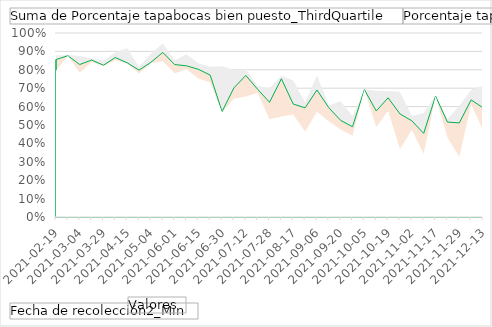
| Category | Suma de Porcentaje tapabocas bien puesto_ThirdQuartile | Porcentaje tapabocas bien puesto. | Suma de Porcentaje tapabocas bien puesto_FirstQuartile |
|---|---|---|---|
| 2021-02-19 | 0.878 | 0.856 | 0.795 |
| 2021-02-23 | 0.88 | 0.876 | 0.876 |
| 2021-03-04 | 0.875 | 0.829 | 0.784 |
| 2021-03-10 | 0.861 | 0.853 | 0.841 |
| 2021-03-29 | 0.85 | 0.825 | 0.82 |
| 2021-04-06 | 0.893 | 0.867 | 0.852 |
| 2021-04-15 | 0.917 | 0.838 | 0.832 |
| 2021-04-20 | 0.817 | 0.798 | 0.78 |
| 2021-05-04 | 0.887 | 0.841 | 0.836 |
| 2021-05-21 | 0.943 | 0.894 | 0.846 |
| 2021-06-01 | 0.851 | 0.829 | 0.781 |
| 2021-06-08 | 0.884 | 0.822 | 0.802 |
| 2021-06-15 | 0.836 | 0.803 | 0.753 |
| 2021-06-21 | 0.817 | 0.771 | 0.731 |
| 2021-06-30 | 0.819 | 0.573 | 0.568 |
| 2021-07-06 | 0.798 | 0.702 | 0.642 |
| 2021-07-12 | 0.802 | 0.769 | 0.656 |
| 2021-07-19 | 0.714 | 0.694 | 0.675 |
| 2021-07-28 | 0.698 | 0.623 | 0.531 |
| 2021-08-03 | 0.767 | 0.751 | 0.546 |
| 2021-08-17 | 0.741 | 0.614 | 0.557 |
| 2021-08-30 | 0.622 | 0.593 | 0.464 |
| 2021-09-06 | 0.769 | 0.69 | 0.571 |
| 2021-09-13 | 0.607 | 0.594 | 0.521 |
| 2021-09-20 | 0.63 | 0.525 | 0.475 |
| 2021-09-27 | 0.546 | 0.491 | 0.441 |
| 2021-10-05 | 0.692 | 0.692 | 0.692 |
| 2021-10-13 | 0.686 | 0.576 | 0.489 |
| 2021-10-19 | 0.685 | 0.648 | 0.578 |
| 2021-10-26 | 0.679 | 0.56 | 0.369 |
| 2021-11-02 | 0.55 | 0.523 | 0.473 |
| 2021-11-09 | 0.565 | 0.454 | 0.344 |
| 2021-11-17 | 0.657 | 0.657 | 0.657 |
| 2021-11-22 | 0.533 | 0.516 | 0.432 |
| 2021-11-29 | 0.604 | 0.511 | 0.327 |
| 2021-12-07 | 0.691 | 0.636 | 0.613 |
| 2021-12-13 | 0.714 | 0.594 | 0.473 |